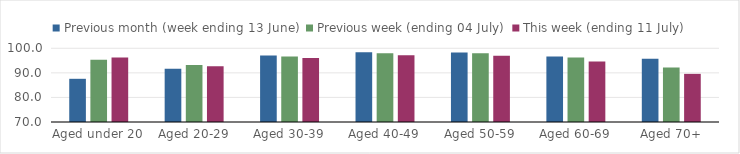
| Category | Previous month (week ending 13 June) | Previous week (ending 04 July) | This week (ending 11 July) |
|---|---|---|---|
| Aged under 20 | 87.581 | 95.376 | 96.217 |
| Aged 20-29 | 91.719 | 93.236 | 92.718 |
| Aged 30-39 | 97.103 | 96.676 | 96.075 |
| Aged 40-49 | 98.337 | 97.95 | 97.194 |
| Aged 50-59 | 98.328 | 97.978 | 96.96 |
| Aged 60-69 | 96.683 | 96.277 | 94.575 |
| Aged 70+ | 95.719 | 92.18 | 89.594 |